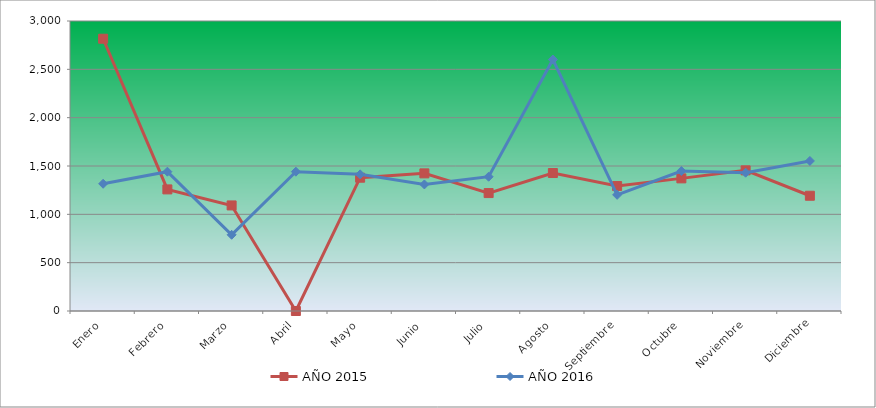
| Category | AÑO 2015 | AÑO 2016 |
|---|---|---|
| Enero | 2816.598 | 1316.181 |
| Febrero | 1257.965 | 1441.201 |
| Marzo | 1092.08 | 788.32 |
| Abril | 0 | 1441.201 |
| Mayo | 1378.923 | 1413.419 |
| Junio | 1423.851 | 1309.235 |
| Julio | 1219.95 | 1389.109 |
| Agosto | 1427.307 | 2601.107 |
| Septiembre | 1292.525 | 1201.58 |
| Octubre | 1372.011 | 1448.146 |
| Noviembre | 1454.954 | 1430.783 |
| Diciembre | 1192.302 | 1552.33 |